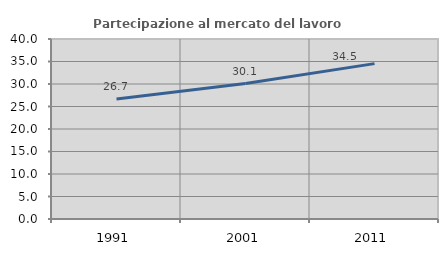
| Category | Partecipazione al mercato del lavoro  femminile |
|---|---|
| 1991.0 | 26.686 |
| 2001.0 | 30.089 |
| 2011.0 | 34.529 |